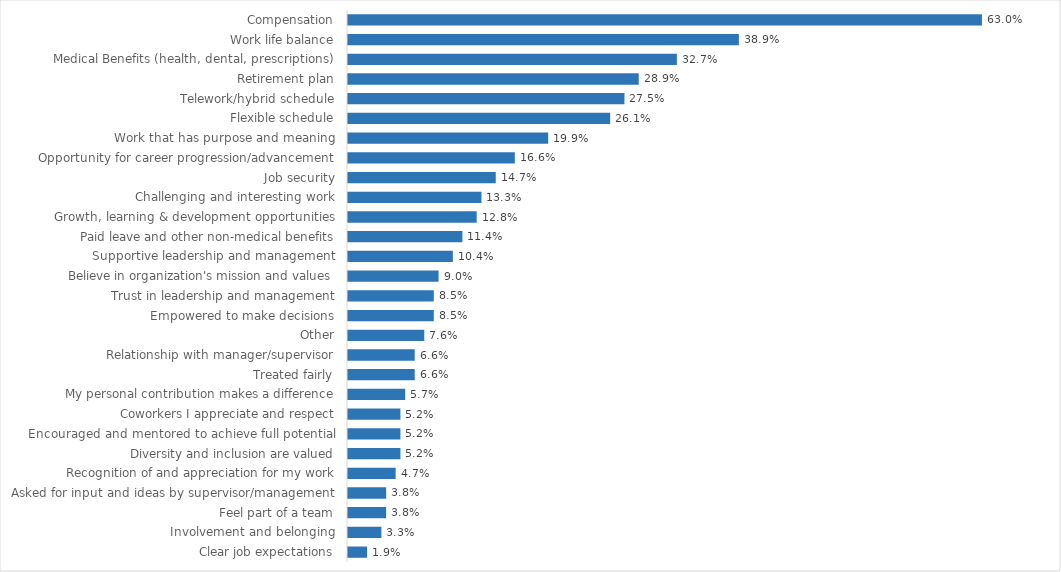
| Category | Disabilities, Aging, Independent Living |
|---|---|
| Compensation | 0.63 |
| Work life balance | 0.389 |
| Medical Benefits (health, dental, prescriptions) | 0.327 |
| Retirement plan | 0.289 |
| Telework/hybrid schedule | 0.275 |
| Flexible schedule | 0.261 |
| Work that has purpose and meaning | 0.199 |
| Opportunity for career progression/advancement | 0.166 |
| Job security | 0.147 |
| Challenging and interesting work | 0.133 |
| Growth, learning & development opportunities | 0.128 |
| Paid leave and other non-medical benefits | 0.114 |
| Supportive leadership and management | 0.104 |
| Believe in organization's mission and values | 0.09 |
| Trust in leadership and management | 0.085 |
| Empowered to make decisions | 0.085 |
| Other | 0.076 |
| Relationship with manager/supervisor | 0.066 |
| Treated fairly | 0.066 |
| My personal contribution makes a difference | 0.057 |
| Coworkers I appreciate and respect | 0.052 |
| Encouraged and mentored to achieve full potential | 0.052 |
| Diversity and inclusion are valued | 0.052 |
| Recognition of and appreciation for my work | 0.047 |
| Asked for input and ideas by supervisor/management | 0.038 |
| Feel part of a team | 0.038 |
| Involvement and belonging | 0.033 |
| Clear job expectations | 0.019 |